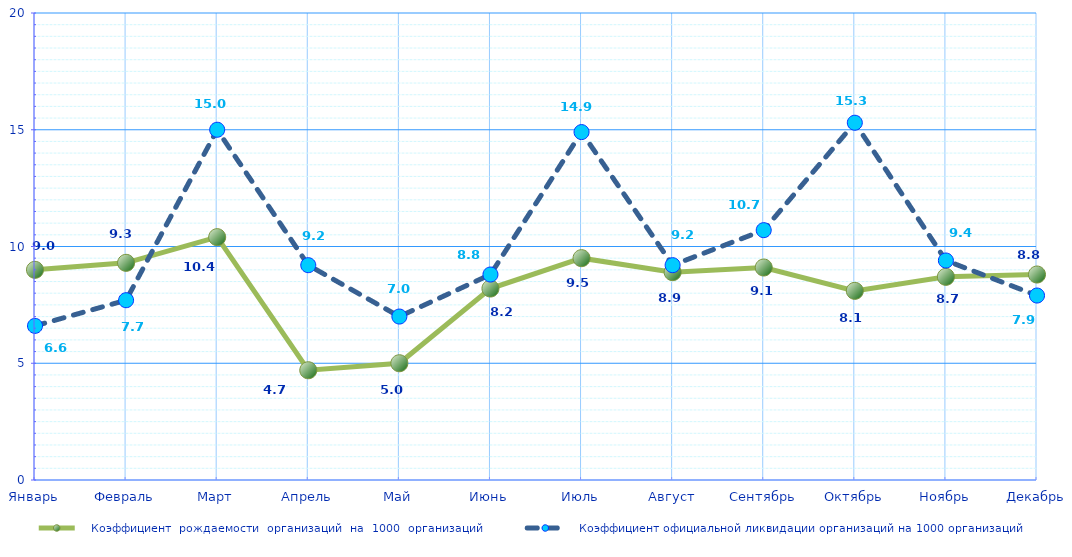
| Category |    Коэффициент  рождаемости  организаций  на  1000  организаций |    Коэффициент официальной ликвидации организаций на 1000 организаций |
|---|---|---|
| Январь | 9 | 6.6 |
| Февраль | 9.3 | 7.7 |
| Март | 10.4 | 15 |
| Апрель | 4.7 | 9.2 |
| Май | 5 | 7 |
| Июнь | 8.2 | 8.8 |
| Июль | 9.5 | 14.9 |
| Август | 8.9 | 9.2 |
| Сентябрь | 9.1 | 10.7 |
| Октябрь | 8.1 | 15.3 |
| Ноябрь | 8.7 | 9.4 |
| Декабрь | 8.8 | 7.9 |